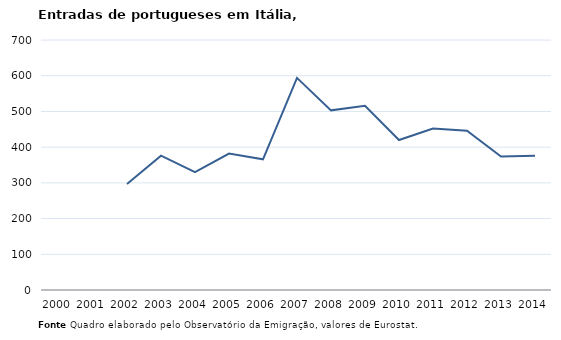
| Category | Series 0 |
|---|---|
| 2000.0 | 328 |
| 2001.0 | 0 |
| 2002.0 | 297 |
| 2003.0 | 376 |
| 2004.0 | 330 |
| 2005.0 | 382 |
| 2006.0 | 366 |
| 2007.0 | 594 |
| 2008.0 | 503 |
| 2009.0 | 516 |
| 2010.0 | 420 |
| 2011.0 | 452 |
| 2012.0 | 446 |
| 2013.0 | 374 |
| 2014.0 | 376 |